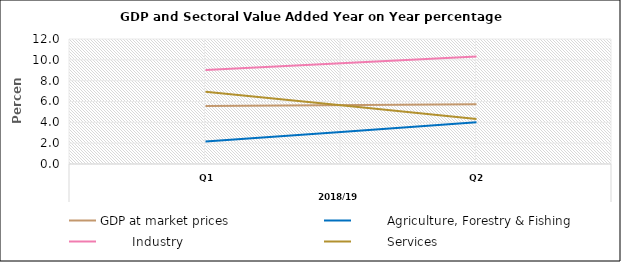
| Category | GDP at market prices |         Agriculture, Forestry & Fishing |         Industry |         Services |
|---|---|---|---|---|
| 0 | 5.569 | 2.154 | 9.025 | 6.943 |
| 1 | 5.729 | 4.01 | 10.322 | 4.329 |